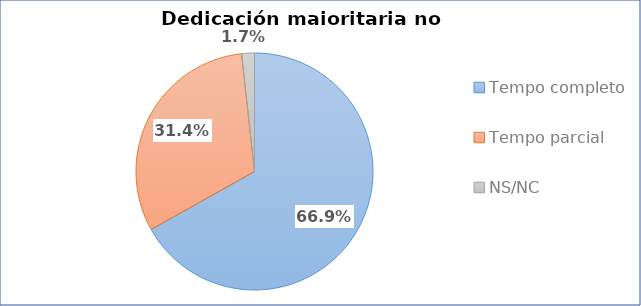
| Category | Series 0 |
|---|---|
| Tempo completo | 0.669 |
| Tempo parcial | 0.314 |
| NS/NC | 0.017 |